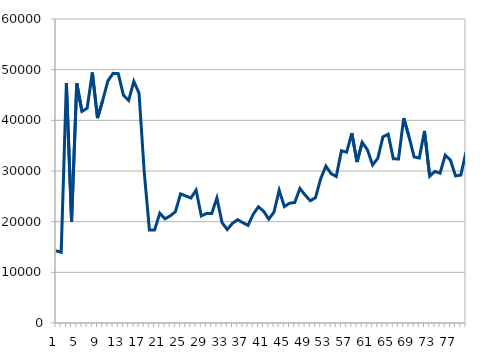
| Category | LeiteIndSP |
|---|---|
| 0 | 14249 |
| 1 | 13962 |
| 2 | 47362 |
| 3 | 20040 |
| 4 | 47338 |
| 5 | 41762 |
| 6 | 42389 |
| 7 | 49447 |
| 8 | 40451 |
| 9 | 43932 |
| 10 | 47792 |
| 11 | 49268 |
| 12 | 49217 |
| 13 | 44932 |
| 14 | 43939 |
| 15 | 47681 |
| 16 | 45383 |
| 17 | 29786 |
| 18 | 18343 |
| 19 | 18375 |
| 20 | 21665 |
| 21 | 20553 |
| 22 | 21145 |
| 23 | 21959 |
| 24 | 25482 |
| 25 | 25089 |
| 26 | 24668 |
| 27 | 26227 |
| 28 | 21128 |
| 29 | 21626 |
| 30 | 21592 |
| 31 | 24662 |
| 32 | 19799 |
| 33 | 18449 |
| 34 | 19674 |
| 35 | 20388 |
| 36 | 19801 |
| 37 | 19262 |
| 38 | 21474 |
| 39 | 22941 |
| 40 | 22064 |
| 41 | 20513 |
| 42 | 21880 |
| 43 | 26199 |
| 44 | 22980 |
| 45 | 23639 |
| 46 | 23789 |
| 47 | 26557 |
| 48 | 25241 |
| 49 | 24136 |
| 50 | 24732 |
| 51 | 28474 |
| 52 | 30969 |
| 53 | 29486 |
| 54 | 28916 |
| 55 | 33993 |
| 56 | 33719 |
| 57 | 37463 |
| 58 | 31766 |
| 59 | 35655 |
| 60 | 34203 |
| 61 | 31196 |
| 62 | 32506 |
| 63 | 36743 |
| 64 | 37267 |
| 65 | 32418 |
| 66 | 32369 |
| 67 | 40450 |
| 68 | 36831 |
| 69 | 32783 |
| 70 | 32562 |
| 71 | 37909 |
| 72 | 28973 |
| 73 | 29926 |
| 74 | 29584 |
| 75 | 33126 |
| 76 | 32125 |
| 77 | 29032 |
| 78 | 29193 |
| 79 | 33752 |